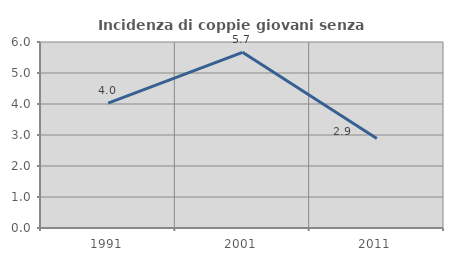
| Category | Incidenza di coppie giovani senza figli |
|---|---|
| 1991.0 | 4.029 |
| 2001.0 | 5.667 |
| 2011.0 | 2.89 |